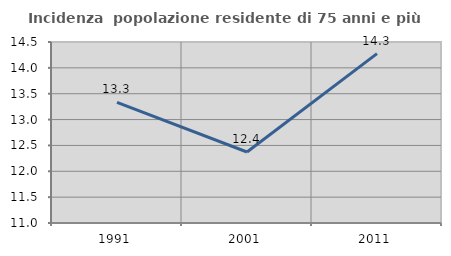
| Category | Incidenza  popolazione residente di 75 anni e più |
|---|---|
| 1991.0 | 13.333 |
| 2001.0 | 12.373 |
| 2011.0 | 14.275 |